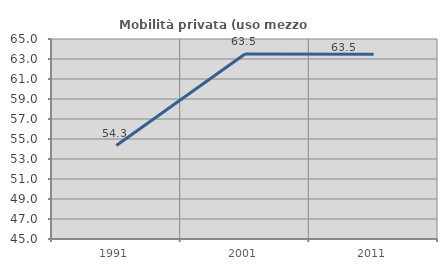
| Category | Mobilità privata (uso mezzo privato) |
|---|---|
| 1991.0 | 54.348 |
| 2001.0 | 63.504 |
| 2011.0 | 63.467 |